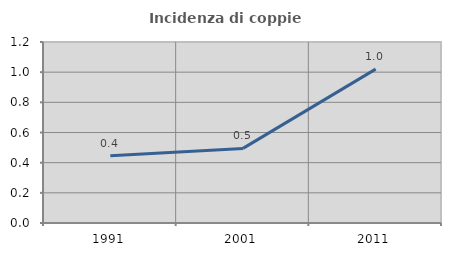
| Category | Incidenza di coppie miste |
|---|---|
| 1991.0 | 0.446 |
| 2001.0 | 0.495 |
| 2011.0 | 1.02 |